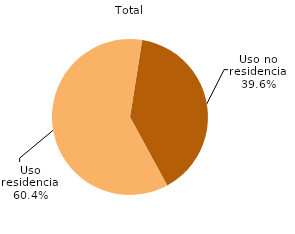
| Category | Series 0 |
|---|---|
| Uso no residencial | 0.396 |
| Uso residencial | 0.604 |